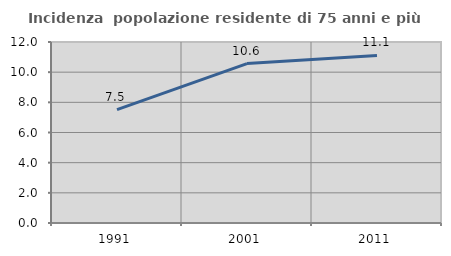
| Category | Incidenza  popolazione residente di 75 anni e più |
|---|---|
| 1991.0 | 7.514 |
| 2001.0 | 10.569 |
| 2011.0 | 11.111 |